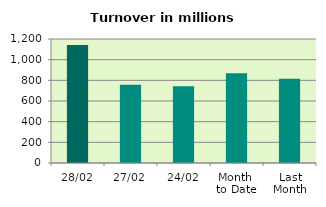
| Category | Series 0 |
|---|---|
| 28/02 | 1142.289 |
| 27/02 | 757.733 |
| 24/02 | 743.393 |
| Month 
to Date | 868.35 |
| Last
Month | 814.821 |